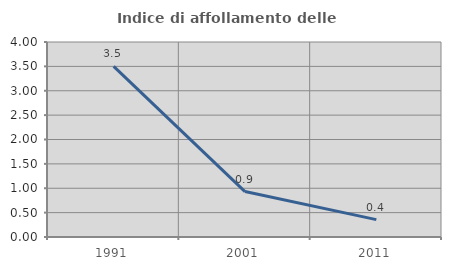
| Category | Indice di affollamento delle abitazioni  |
|---|---|
| 1991.0 | 3.501 |
| 2001.0 | 0.932 |
| 2011.0 | 0.357 |